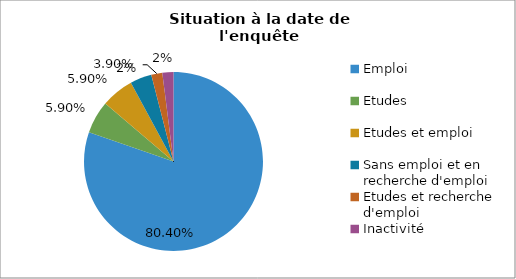
| Category | Promotion 2008 |
|---|---|
| Emploi | 0.804 |
| Etudes | 0.059 |
| Etudes et emploi | 0.059 |
| Sans emploi et en recherche d'emploi | 0.039 |
| Etudes et recherche d'emploi | 0.02 |
| Inactivité | 0.02 |